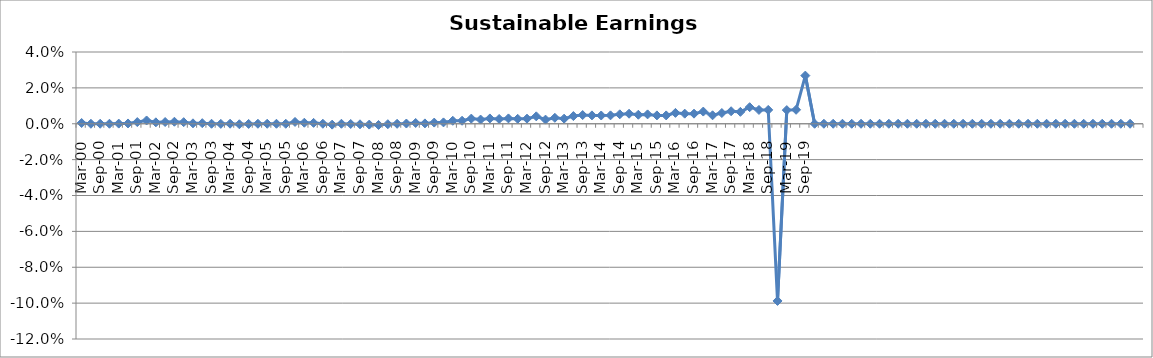
| Category | Sustainable Earnings Indicator |
|---|---|
| Mar-00 | 0 |
| Jun-00 | 0 |
| Sep-00 | 0 |
| Dec-00 | 0 |
| Mar-01 | 0 |
| Jun-01 | 0 |
| Sep-01 | 0.001 |
| Dec-01 | 0.002 |
| Mar-02 | 0.001 |
| Jun-02 | 0.001 |
| Sep-02 | 0.001 |
| Dec-02 | 0.001 |
| Mar-03 | 0 |
| Jun-03 | 0 |
| Sep-03 | 0 |
| Dec-03 | 0 |
| Mar-04 | 0 |
| Jun-04 | 0 |
| Sep-04 | 0 |
| Dec-04 | 0 |
| Mar-05 | 0 |
| Jun-05 | 0 |
| Sep-05 | 0 |
| Dec-05 | 0.001 |
| Mar-06 | 0.001 |
| Jun-06 | 0 |
| Sep-06 | 0 |
| Dec-06 | 0 |
| Mar-07 | 0 |
| Jun-07 | 0 |
| Sep-07 | 0 |
| Dec-07 | 0 |
| Mar-08 | -0.001 |
| Jun-08 | 0 |
| Sep-08 | 0 |
| Dec-08 | 0 |
| Mar-09 | 0 |
| Jun-09 | 0 |
| Sep-09 | 0.001 |
| Dec-09 | 0.001 |
| Mar-10 | 0.002 |
| Jun-10 | 0.002 |
| Sep-10 | 0.003 |
| Dec-10 | 0.002 |
| Mar-11 | 0.003 |
| Jun-11 | 0.003 |
| Sep-11 | 0.003 |
| Dec-11 | 0.003 |
| Mar-12 | 0.003 |
| Jun-12 | 0.004 |
| Sep-12 | 0.002 |
| Dec-12 | 0.003 |
| Mar-13 | 0.003 |
| Jun-13 | 0.004 |
| Sep-13 | 0.005 |
| Dec-13 | 0.005 |
| Mar-14 | 0.005 |
| Jun-14 | 0.005 |
| Sep-14 | 0.005 |
| Dec-14 | 0.006 |
| Mar-15 | 0.005 |
| Jun-15 | 0.005 |
| Sep-15 | 0.005 |
| Dec-15 | 0.005 |
| Mar-16 | 0.006 |
| Jun-16 | 0.006 |
| Sep-16 | 0.006 |
| Dec-16 | 0.007 |
| Mar-17 | 0.005 |
| Jun-17 | 0.006 |
| Sep-17 | 0.007 |
| Dec-17 | 0.007 |
| Mar-18 | 0.009 |
| Jun-18 | 0.008 |
| Sep-18 | 0.008 |
| Dec-18 | -0.099 |
| Mar-19 | 0.008 |
| Jun-19 | 0.008 |
| Sep-19 | 0.027 |